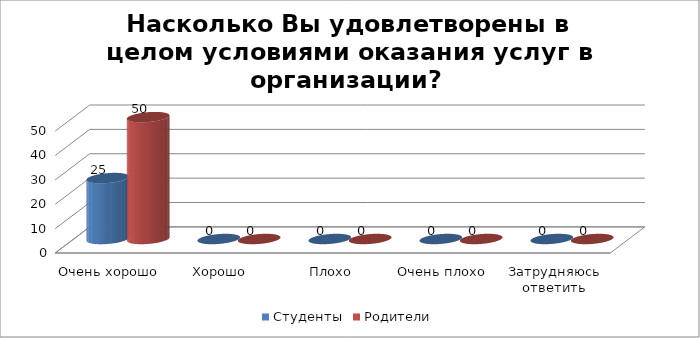
| Category | Студенты | Родители |
|---|---|---|
| Очень хорошо | 25 | 50 |
| Хорошо | 0 | 0 |
| Плохо | 0 | 0 |
| Очень плохо | 0 | 0 |
| Затрудняюсь ответить | 0 | 0 |